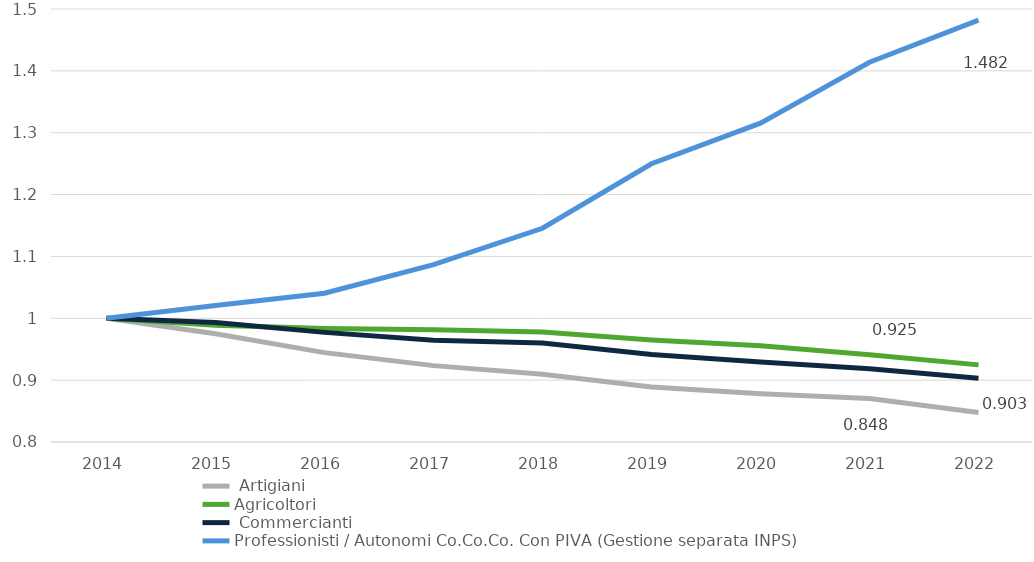
| Category |  Artigiani | Agricoltori |  Commercianti | Professionisti / Autonomi Co.Co.Co. Con PIVA (Gestione separata INPS) |
|---|---|---|---|---|
| 2014.0 | 1 | 1 | 1 | 1 |
| 2015.0 | 0.975 | 0.989 | 0.993 | 1.021 |
| 2016.0 | 0.944 | 0.983 | 0.977 | 1.041 |
| 2017.0 | 0.923 | 0.981 | 0.965 | 1.087 |
| 2018.0 | 0.909 | 0.978 | 0.96 | 1.146 |
| 2019.0 | 0.889 | 0.965 | 0.941 | 1.25 |
| 2020.0 | 0.878 | 0.956 | 0.929 | 1.315 |
| 2021.0 | 0.87 | 0.941 | 0.918 | 1.414 |
| 2022.0 | 0.848 | 0.925 | 0.903 | 1.482 |